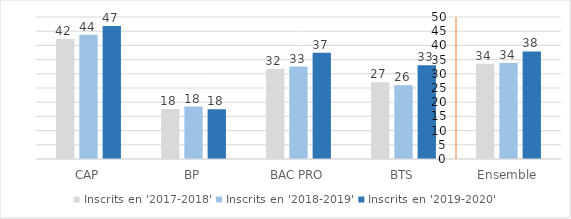
| Category | Inscrits en '2017-2018' | Inscrits en '2018-2019' | Inscrits en '2019-2020' |
|---|---|---|---|
| CAP | 42.29 | 43.77 | 46.83 |
| BP | 17.61 | 18.45 | 17.52 |
| BAC PRO | 31.77 | 32.55 | 37.43 |
| BTS | 27.02 | 25.96 | 32.98 |
| Ensemble | 33.54 | 33.831 | 37.857 |